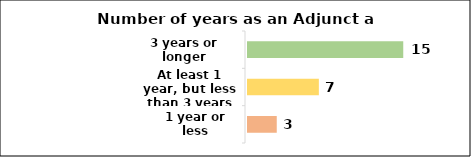
| Category | 1 year or less |
|---|---|
| 1 year or less | 3 |
| At least 1 year, but less than 3 years | 7 |
| 3 years or longer | 15 |